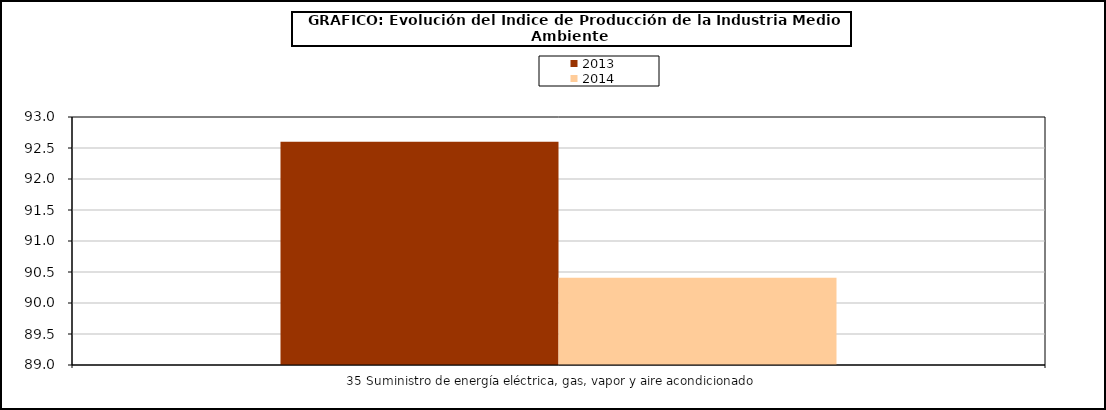
| Category | 2013 | 2014 |
|---|---|---|
| 35 Suministro de energía eléctrica, gas, vapor y aire acondicionado     | 92.602 | 90.406 |